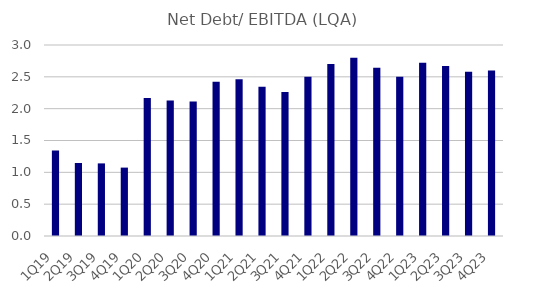
| Category | Net Debt/ EBITDA (LQA) |
|---|---|
| 1Q19 | 1.342 |
| 2Q19 | 1.146 |
| 3Q19 | 1.14 |
| 4Q19 | 1.074 |
| 1Q20 | 2.167 |
| 2Q20 | 2.129 |
| 3Q20 | 2.111 |
| 4Q20 | 2.422 |
| 1Q21 | 2.463 |
| 2Q21 | 2.344 |
| 3Q21 | 2.263 |
| 4Q21 | 2.5 |
| 1Q22 | 2.7 |
| 2Q22 | 2.8 |
| 3Q22 | 2.643 |
| 4Q22 | 2.502 |
| 1Q23 | 2.723 |
| 2Q23 | 2.67 |
| 3Q23 | 2.579 |
| 4Q23 | 2.6 |